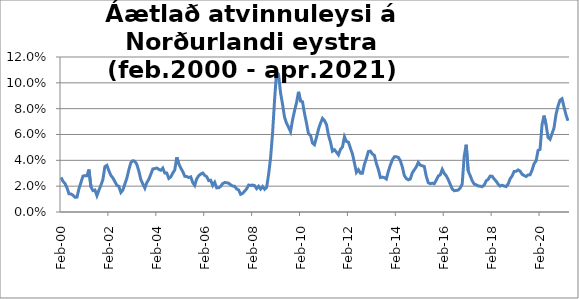
| Category | Series 0 |
|---|---|
| 2000-02-01 | 0.027 |
| 2000-03-01 | 0.024 |
| 2000-04-01 | 0.022 |
| 2000-05-01 | 0.019 |
| 2000-06-01 | 0.014 |
| 2000-07-01 | 0.014 |
| 2000-08-01 | 0.013 |
| 2000-09-01 | 0.011 |
| 2000-10-01 | 0.011 |
| 2000-11-01 | 0.018 |
| 2000-12-01 | 0.023 |
| 2001-01-01 | 0.028 |
| 2001-02-01 | 0.028 |
| 2001-03-01 | 0.028 |
| 2001-04-01 | 0.033 |
| 2001-05-01 | 0.019 |
| 2001-06-01 | 0.017 |
| 2001-07-01 | 0.017 |
| 2001-08-01 | 0.013 |
| 2001-09-01 | 0.017 |
| 2001-10-01 | 0.021 |
| 2001-11-01 | 0.025 |
| 2001-12-01 | 0.035 |
| 2002-01-01 | 0.036 |
| 2002-02-01 | 0.032 |
| 2002-03-01 | 0.028 |
| 2002-04-01 | 0.026 |
| 2002-05-01 | 0.024 |
| 2002-06-01 | 0.021 |
| 2002-07-01 | 0.02 |
| 2002-08-01 | 0.015 |
| 2002-09-01 | 0.017 |
| 2002-10-01 | 0.022 |
| 2002-11-01 | 0.026 |
| 2002-12-01 | 0.033 |
| 2003-01-01 | 0.038 |
| 2003-02-01 | 0.04 |
| 2003-03-01 | 0.039 |
| 2003-04-01 | 0.037 |
| 2003-05-01 | 0.032 |
| 2003-06-01 | 0.025 |
| 2003-07-01 | 0.022 |
| 2003-08-01 | 0.018 |
| 2003-09-01 | 0.023 |
| 2003-10-01 | 0.025 |
| 2003-11-01 | 0.029 |
| 2003-12-01 | 0.033 |
| 2004-01-01 | 0.034 |
| 2004-02-01 | 0.034 |
| 2004-03-01 | 0.033 |
| 2004-04-01 | 0.032 |
| 2004-05-01 | 0.034 |
| 2004-06-01 | 0.03 |
| 2004-07-01 | 0.03 |
| 2004-08-01 | 0.026 |
| 2004-09-01 | 0.027 |
| 2004-10-01 | 0.03 |
| 2004-11-01 | 0.033 |
| 2004-12-01 | 0.042 |
| 2005-01-01 | 0.037 |
| 2005-02-01 | 0.034 |
| 2005-03-01 | 0.031 |
| 2005-04-01 | 0.028 |
| 2005-05-01 | 0.027 |
| 2005-06-01 | 0.027 |
| 2005-07-01 | 0.027 |
| 2005-08-01 | 0.023 |
| 2005-09-01 | 0.021 |
| 2005-10-01 | 0.026 |
| 2005-11-01 | 0.028 |
| 2005-12-01 | 0.029 |
| 2006-01-01 | 0.03 |
| 2006-02-01 | 0.028 |
| 2006-03-01 | 0.027 |
| 2006-04-01 | 0.024 |
| 2006-05-01 | 0.025 |
| 2006-06-01 | 0.021 |
| 2006-07-01 | 0.023 |
| 2006-08-01 | 0.019 |
| 2006-09-01 | 0.019 |
| 2006-10-01 | 0.02 |
| 2006-11-01 | 0.022 |
| 2006-12-01 | 0.023 |
| 2007-01-01 | 0.023 |
| 2007-02-01 | 0.022 |
| 2007-03-01 | 0.021 |
| 2007-04-01 | 0.02 |
| 2007-05-01 | 0.02 |
| 2007-06-01 | 0.018 |
| 2007-07-01 | 0.017 |
| 2007-08-01 | 0.014 |
| 2007-09-01 | 0.014 |
| 2007-10-01 | 0.016 |
| 2007-11-01 | 0.018 |
| 2007-12-01 | 0.021 |
| 2008-01-01 | 0.021 |
| 2008-02-01 | 0.021 |
| 2008-03-01 | 0.02 |
| 2008-04-01 | 0.018 |
| 2008-05-01 | 0.02 |
| 2008-06-01 | 0.018 |
| 2008-07-01 | 0.02 |
| 2008-08-01 | 0.018 |
| 2008-09-01 | 0.019 |
| 2008-10-01 | 0.029 |
| 2008-11-01 | 0.042 |
| 2008-12-01 | 0.061 |
| 2009-01-01 | 0.087 |
| 2009-02-01 | 0.109 |
| 2009-03-01 | 0.106 |
| 2009-04-01 | 0.092 |
| 2009-05-01 | 0.083 |
| 2009-06-01 | 0.073 |
| 2009-07-01 | 0.069 |
| 2009-08-01 | 0.066 |
| 2009-09-01 | 0.062 |
| 2009-10-01 | 0.071 |
| 2009-11-01 | 0.078 |
| 2009-12-01 | 0.085 |
| 2010-01-01 | 0.093 |
| 2010-02-01 | 0.086 |
| 2010-03-01 | 0.085 |
| 2010-04-01 | 0.076 |
| 2010-05-01 | 0.069 |
| 2010-06-01 | 0.06 |
| 2010-07-01 | 0.059 |
| 2010-08-01 | 0.053 |
| 2010-09-01 | 0.052 |
| 2010-10-01 | 0.058 |
| 2010-11-01 | 0.064 |
| 2010-12-01 | 0.069 |
| 2011-01-01 | 0.072 |
| 2011-02-01 | 0.071 |
| 2011-03-01 | 0.068 |
| 2011-04-01 | 0.059 |
| 2011-05-01 | 0.054 |
| 2011-06-01 | 0.047 |
| 2011-07-01 | 0.048 |
| 2011-08-01 | 0.046 |
| 2011-09-01 | 0.044 |
| 2011-10-01 | 0.049 |
| 2011-11-01 | 0.05 |
| 2011-12-01 | 0.058 |
| 2012-01-01 | 0.055 |
| 2012-02-01 | 0.054 |
| 2012-03-01 | 0.049 |
| 2012-04-01 | 0.045 |
| 2012-05-01 | 0.038 |
| 2012-06-01 | 0.031 |
| 2012-07-01 | 0.033 |
| 2012-08-01 | 0.03 |
| 2012-09-01 | 0.03 |
| 2012-10-01 | 0.037 |
| 2012-11-01 | 0.042 |
| 2012-12-01 | 0.047 |
| 2013-01-01 | 0.047 |
| 2013-02-01 | 0.045 |
| 2013-03-01 | 0.044 |
| 2013-04-01 | 0.037 |
| 2013-05-01 | 0.033 |
| 2013-06-01 | 0.027 |
| 2013-07-01 | 0.027 |
| 2013-08-01 | 0.027 |
| 2013-09-01 | 0.026 |
| 2013-10-01 | 0.032 |
| 2013-11-01 | 0.036 |
| 2013-12-01 | 0.04 |
| 2014-01-01 | 0.043 |
| 2014-02-01 | 0.043 |
| 2014-03-01 | 0.042 |
| 2014-04-01 | 0.04 |
| 2014-05-01 | 0.035 |
| 2014-06-01 | 0.028 |
| 2014-07-01 | 0.026 |
| 2014-08-01 | 0.025 |
| 2014-09-01 | 0.026 |
| 2014-10-01 | 0.03 |
| 2014-11-01 | 0.033 |
| 2014-12-01 | 0.035 |
| 2015-01-01 | 0.038 |
| 2015-02-01 | 0.036 |
| 2015-03-01 | 0.036 |
| 2015-04-01 | 0.035 |
| 2015-05-01 | 0.028 |
| 2015-06-01 | 0.023 |
| 2015-07-01 | 0.022 |
| 2015-08-01 | 0.022 |
| 2015-09-01 | 0.022 |
| 2015-10-01 | 0.025 |
| 2015-11-01 | 0.028 |
| 2015-12-01 | 0.029 |
| 2016-01-01 | 0.033 |
| 2016-02-01 | 0.03 |
| 2016-03-01 | 0.028 |
| 2016-04-01 | 0.025 |
| 2016-05-01 | 0.021 |
| 2016-06-01 | 0.018 |
| 2016-07-01 | 0.016 |
| 2016-08-01 | 0.017 |
| 2016-09-01 | 0.017 |
| 2016-10-01 | 0.019 |
| 2016-11-01 | 0.022 |
| 2016-12-01 | 0.043 |
| 2017-01-01 | 0.052 |
| 2017-02-01 | 0.032 |
| 2017-03-01 | 0.028 |
| 2017-04-01 | 0.024 |
| 2017-05-01 | 0.022 |
| 2017-06-01 | 0.021 |
| 2017-07-01 | 0.02 |
| 2017-08-01 | 0.02 |
| 2017-09-01 | 0.02 |
| 2017-10-01 | 0.021 |
| 2017-11-01 | 0.024 |
| 2017-12-01 | 0.025 |
| 2018-01-01 | 0.028 |
| 2018-02-01 | 0.028 |
| 2018-03-01 | 0.026 |
| 2018-04-01 | 0.024 |
| 2018-05-01 | 0.022 |
| 2018-06-01 | 0.02 |
| 2018-07-01 | 0.021 |
| 2018-08-01 | 0.02 |
| 2018-09-01 | 0.02 |
| 2018-10-01 | 0.022 |
| 2018-11-01 | 0.026 |
| 2018-12-01 | 0.028 |
| 2019-01-01 | 0.031 |
| 2019-02-01 | 0.032 |
| 2019-03-01 | 0.033 |
| 2019-04-01 | 0.032 |
| 2019-05-01 | 0.029 |
| 2019-06-01 | 0.028 |
| 2019-07-01 | 0.027 |
| 2019-08-01 | 0.029 |
| 2019-09-01 | 0.029 |
| 2019-10-01 | 0.032 |
| 2019-11-01 | 0.037 |
| 2019-12-01 | 0.039 |
| 2020-01-01 | 0.048 |
| 2020-02-01 | 0.048 |
| 2020-03-01 | 0.068 |
| 2020-04-01 | 0.075 |
| 2020-05-01 | 0.068 |
| 2020-06-01 | 0.058 |
| 2020-07-01 | 0.056 |
| 2020-08-01 | 0.061 |
| 2020-09-01 | 0.065 |
| 2020-10-01 | 0.076 |
| 2020-11-01 | 0.082 |
| 2020-12-01 | 0.087 |
| 2021-01-01 | 0.088 |
| 2021-02-01 | 0.081 |
| 2021-03-01 | 0.075 |
| 2021-04-01 | 0.071 |